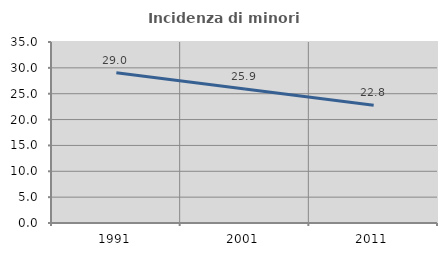
| Category | Incidenza di minori stranieri |
|---|---|
| 1991.0 | 29.032 |
| 2001.0 | 25.904 |
| 2011.0 | 22.774 |